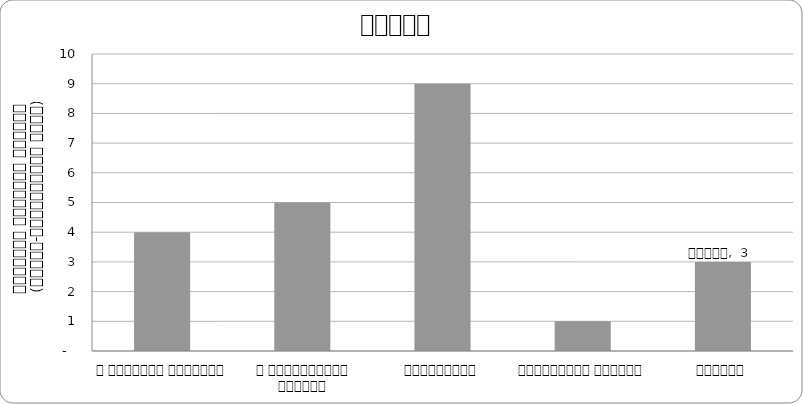
| Category | न्याय |
|---|---|
| द हिमालयन टाइम्स् | 4 |
| द काठमाण्डौं पोस्ट् | 5 |
| कान्तिपुर | 9 |
| अन्नपूर्ण पोस्ट् | 1 |
| नागरिक | 3 |